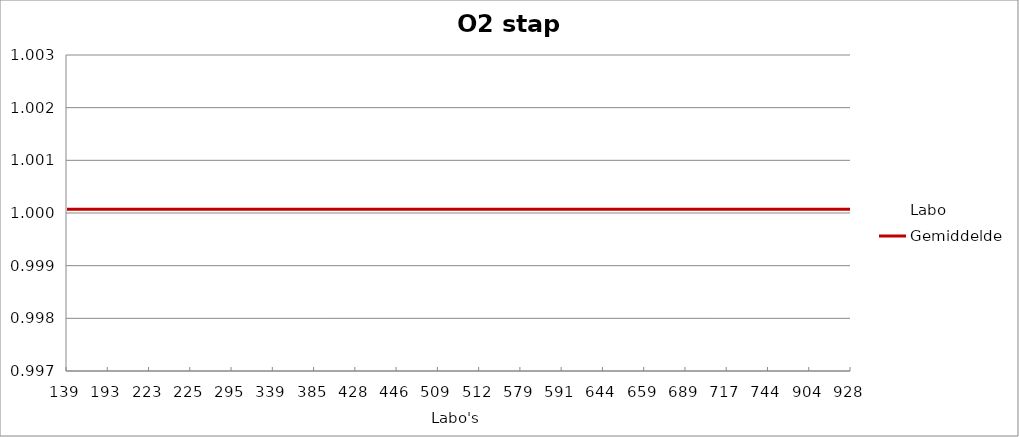
| Category | Labo | Gemiddelde |
|---|---|---|
| 139.0 | 1.002 | 1 |
| 193.0 | 1 | 1 |
| 223.0 | 1.001 | 1 |
| 225.0 | 1.002 | 1 |
| 295.0 | 1 | 1 |
| 339.0 | 1 | 1 |
| 385.0 | 1 | 1 |
| 428.0 | 1.001 | 1 |
| 446.0 | 1.001 | 1 |
| 509.0 | 1 | 1 |
| 512.0 | 1 | 1 |
| 579.0 | 1 | 1 |
| 591.0 | 1 | 1 |
| 644.0 | 0.999 | 1 |
| 659.0 | 1 | 1 |
| 689.0 | 0.999 | 1 |
| 717.0 | 0.999 | 1 |
| 744.0 | 1.001 | 1 |
| 904.0 | 1.001 | 1 |
| 928.0 | 0.997 | 1 |